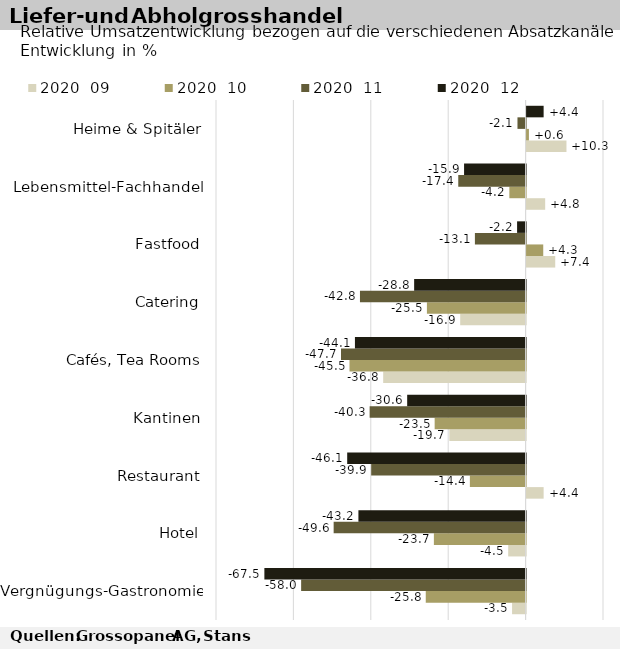
| Category | 2020  |
|---|---|
| Vergnügungs-Gastronomie | -67.5 |
| Hotel | -43.2 |
| Restaurant | -46.1 |
| Kantinen | -30.6 |
| Cafés, Tea Rooms | -44.1 |
| Catering | -28.8 |
| Fastfood | -2.2 |
| Lebensmittel-Fachhandel | -15.9 |
| Heime & Spitäler | 4.4 |